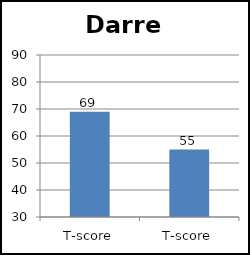
| Category | Darren |
|---|---|
| T-score | 69 |
| T-score | 55 |